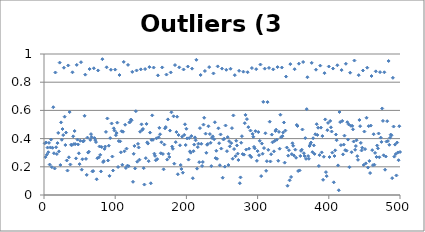
| Category | Outliers (3 dice) |
|---|---|
| 0 | 0.367 |
| 1 | 0.269 |
| 2 | 0.372 |
| 3 | 0.286 |
| 4 | 0.336 |
| 5 | 0.303 |
| 6 | 0.37 |
| 7 | 0.216 |
| 8 | 0.337 |
| 9 | 0.393 |
| 10 | 0.198 |
| 11 | 0.335 |
| 12 | 0.622 |
| 13 | 0.296 |
| 14 | 0.188 |
| 15 | 0.869 |
| 16 | 0.339 |
| 17 | 0.29 |
| 18 | 0.368 |
| 19 | 0.44 |
| 20 | 0.309 |
| 21 | 0.939 |
| 22 | 0.213 |
| 23 | 0.515 |
| 24 | 0.392 |
| 25 | 0.468 |
| 26 | 0.425 |
| 27 | 0.903 |
| 28 | 0.555 |
| 29 | 0.355 |
| 30 | 0.443 |
| 31 | 0.245 |
| 32 | 0.173 |
| 33 | 0.919 |
| 34 | 0.267 |
| 35 | 0.588 |
| 36 | 0.217 |
| 37 | 0.356 |
| 38 | 0.354 |
| 39 | 0.87 |
| 40 | 0.416 |
| 41 | 0.361 |
| 42 | 0.454 |
| 43 | 0.361 |
| 44 | 0.26 |
| 45 | 0.923 |
| 46 | 0.393 |
| 47 | 0.358 |
| 48 | 0.296 |
| 49 | 0.219 |
| 50 | 0.385 |
| 51 | 0.942 |
| 52 | 0.18 |
| 53 | 0.254 |
| 54 | 0.38 |
| 55 | 0.385 |
| 56 | 0.562 |
| 57 | 0.854 |
| 58 | 0.256 |
| 59 | 0.143 |
| 60 | 0.407 |
| 61 | 0.301 |
| 62 | 0.307 |
| 63 | 0.893 |
| 64 | 0.391 |
| 65 | 0.432 |
| 66 | 0.412 |
| 67 | 0.167 |
| 68 | 0.17 |
| 69 | 0.899 |
| 70 | 0.404 |
| 71 | 0.39 |
| 72 | 0.375 |
| 73 | 0.111 |
| 74 | 0.261 |
| 75 | 0.883 |
| 76 | 0.267 |
| 77 | 0.344 |
| 78 | 0.285 |
| 79 | 0.167 |
| 80 | 0.34 |
| 81 | 0.963 |
| 82 | 0.234 |
| 83 | 0.24 |
| 84 | 0.327 |
| 85 | 0.344 |
| 86 | 0.448 |
| 87 | 0.906 |
| 88 | 0.543 |
| 89 | 0.245 |
| 90 | 0.35 |
| 91 | 0.136 |
| 92 | 0.404 |
| 93 | 0.888 |
| 94 | 0.507 |
| 95 | 0.273 |
| 96 | 0.174 |
| 97 | 0.473 |
| 98 | 0.457 |
| 99 | 0.889 |
| 100 | 0.424 |
| 101 | 0.439 |
| 102 | 0.513 |
| 103 | 0.199 |
| 104 | 0.383 |
| 105 | 0.851 |
| 106 | 0.38 |
| 107 | 0.303 |
| 108 | 0.452 |
| 109 | 0.214 |
| 110 | 0.449 |
| 111 | 0.944 |
| 112 | 0.31 |
| 113 | 0.498 |
| 114 | 0.192 |
| 115 | 0.329 |
| 116 | 0.208 |
| 117 | 0.923 |
| 118 | 0.204 |
| 119 | 0.514 |
| 120 | 0.519 |
| 121 | 0.535 |
| 122 | 0.53 |
| 123 | 0.873 |
| 124 | 0.094 |
| 125 | 0.292 |
| 126 | 0.348 |
| 127 | 0.188 |
| 128 | 0.595 |
| 129 | 0.883 |
| 130 | 0.236 |
| 131 | 0.363 |
| 132 | 0.337 |
| 133 | 0.25 |
| 134 | 0.449 |
| 135 | 0.891 |
| 136 | 0.501 |
| 137 | 0.462 |
| 138 | 0.468 |
| 139 | 0.19 |
| 140 | 0.074 |
| 141 | 0.893 |
| 142 | 0.261 |
| 143 | 0.504 |
| 144 | 0.373 |
| 145 | 0.365 |
| 146 | 0.24 |
| 147 | 0.907 |
| 148 | 0.442 |
| 149 | 0.083 |
| 150 | 0.391 |
| 151 | 0.565 |
| 152 | 0.391 |
| 153 | 0.904 |
| 154 | 0.293 |
| 155 | 0.278 |
| 156 | 0.246 |
| 157 | 0.402 |
| 158 | 0.255 |
| 159 | 0.848 |
| 160 | 0.409 |
| 161 | 0.476 |
| 162 | 0.431 |
| 163 | 0.296 |
| 164 | 0.374 |
| 165 | 0.905 |
| 166 | 0.291 |
| 167 | 0.182 |
| 168 | 0.358 |
| 169 | 0.473 |
| 170 | 0.482 |
| 171 | 0.854 |
| 172 | 0.251 |
| 173 | 0.536 |
| 174 | 0.292 |
| 175 | 0.269 |
| 176 | 0.457 |
| 177 | 0.869 |
| 178 | 0.587 |
| 179 | 0.343 |
| 180 | 0.328 |
| 181 | 0.558 |
| 182 | 0.222 |
| 183 | 0.922 |
| 184 | 0.375 |
| 185 | 0.446 |
| 186 | 0.555 |
| 187 | 0.147 |
| 188 | 0.426 |
| 189 | 0.905 |
| 190 | 0.353 |
| 191 | 0.213 |
| 192 | 0.185 |
| 193 | 0.414 |
| 194 | 0.158 |
| 195 | 0.89 |
| 196 | 0.426 |
| 197 | 0.502 |
| 198 | 0.355 |
| 199 | 0.47 |
| 200 | 0.402 |
| 201 | 0.911 |
| 202 | 0.251 |
| 203 | 0.404 |
| 204 | 0.31 |
| 205 | 0.3 |
| 206 | 0.418 |
| 207 | 0.896 |
| 208 | 0.119 |
| 209 | 0.311 |
| 210 | 0.357 |
| 211 | 0.409 |
| 212 | 0.388 |
| 213 | 0.959 |
| 214 | 0.187 |
| 215 | 0.34 |
| 216 | 0.364 |
| 217 | 0.233 |
| 218 | 0.474 |
| 219 | 0.851 |
| 220 | 0.363 |
| 221 | 0.206 |
| 222 | 0.234 |
| 223 | 0.499 |
| 224 | 0.548 |
| 225 | 0.879 |
| 226 | 0.435 |
| 227 | 0.299 |
| 228 | 0.356 |
| 229 | 0.361 |
| 230 | 0.488 |
| 231 | 0.907 |
| 232 | 0.432 |
| 233 | 0.37 |
| 234 | 0.205 |
| 235 | 0.405 |
| 236 | 0.416 |
| 237 | 0.862 |
| 238 | 0.395 |
| 239 | 0.516 |
| 240 | 0.262 |
| 241 | 0.314 |
| 242 | 0.257 |
| 243 | 0.912 |
| 244 | 0.473 |
| 245 | 0.367 |
| 246 | 0.211 |
| 247 | 0.43 |
| 248 | 0.329 |
| 249 | 0.896 |
| 250 | 0.123 |
| 251 | 0.394 |
| 252 | 0.399 |
| 253 | 0.201 |
| 254 | 0.493 |
| 255 | 0.888 |
| 256 | 0.311 |
| 257 | 0.411 |
| 258 | 0.213 |
| 259 | 0.382 |
| 260 | 0.345 |
| 261 | 0.895 |
| 262 | 0.368 |
| 263 | 0.474 |
| 264 | 0.257 |
| 265 | 0.564 |
| 266 | 0.326 |
| 267 | 0.85 |
| 268 | 0.275 |
| 269 | 0.385 |
| 270 | 0.352 |
| 271 | 0.293 |
| 272 | 0.248 |
| 273 | 0.881 |
| 274 | 0.084 |
| 275 | 0.125 |
| 276 | 0.371 |
| 277 | 0.417 |
| 278 | 0.29 |
| 279 | 0.875 |
| 280 | 0.286 |
| 281 | 0.509 |
| 282 | 0.568 |
| 283 | 0.322 |
| 284 | 0.538 |
| 285 | 0.871 |
| 286 | 0.482 |
| 287 | 0.328 |
| 288 | 0.28 |
| 289 | 0.457 |
| 290 | 0.269 |
| 291 | 0.9 |
| 292 | 0.433 |
| 293 | 0.413 |
| 294 | 0.341 |
| 295 | 0.33 |
| 296 | 0.453 |
| 297 | 0.892 |
| 298 | 0.242 |
| 299 | 0.311 |
| 300 | 0.447 |
| 301 | 0.282 |
| 302 | 0.384 |
| 303 | 0.925 |
| 304 | 0.134 |
| 305 | 0.365 |
| 306 | 0.293 |
| 307 | 0.661 |
| 308 | 0.333 |
| 309 | 0.896 |
| 310 | 0.438 |
| 311 | 0.171 |
| 312 | 0.24 |
| 313 | 0.659 |
| 314 | 0.32 |
| 315 | 0.901 |
| 316 | 0.52 |
| 317 | 0.238 |
| 318 | 0.289 |
| 319 | 0.428 |
| 320 | 0.374 |
| 321 | 0.891 |
| 322 | 0.31 |
| 323 | 0.384 |
| 324 | 0.454 |
| 325 | 0.463 |
| 326 | 0.392 |
| 327 | 0.907 |
| 328 | 0.243 |
| 329 | 0.448 |
| 330 | 0.328 |
| 331 | 0.569 |
| 332 | 0.41 |
| 333 | 0.904 |
| 334 | 0.418 |
| 335 | 0.443 |
| 336 | 0.514 |
| 337 | 0.229 |
| 338 | 0.457 |
| 339 | 0.84 |
| 340 | 0.337 |
| 341 | 0.066 |
| 342 | 0.279 |
| 343 | 0.318 |
| 344 | 0.104 |
| 345 | 0.928 |
| 346 | 0.128 |
| 347 | 0.29 |
| 348 | 0.367 |
| 349 | 0.349 |
| 350 | 0.281 |
| 351 | 0.892 |
| 352 | 0.322 |
| 353 | 0.264 |
| 354 | 0.497 |
| 355 | 0.489 |
| 356 | 0.17 |
| 357 | 0.931 |
| 358 | 0.174 |
| 359 | 0.277 |
| 360 | 0.313 |
| 361 | 0.321 |
| 362 | 0.465 |
| 363 | 0.943 |
| 364 | 0.296 |
| 365 | 0.276 |
| 366 | 0.403 |
| 367 | 0.257 |
| 368 | 0.609 |
| 369 | 0.835 |
| 370 | 0.276 |
| 371 | 0.257 |
| 372 | 0.348 |
| 373 | 0.361 |
| 374 | 0.372 |
| 375 | 0.937 |
| 376 | 0.304 |
| 377 | 0.402 |
| 378 | 0.352 |
| 379 | 0.291 |
| 380 | 0.431 |
| 381 | 0.889 |
| 382 | 0.502 |
| 383 | 0.426 |
| 384 | 0.477 |
| 385 | 0.206 |
| 386 | 0.283 |
| 387 | 0.918 |
| 388 | 0.478 |
| 389 | 0.302 |
| 390 | 0.418 |
| 391 | 0.108 |
| 392 | 0.271 |
| 393 | 0.864 |
| 394 | 0.536 |
| 395 | 0.162 |
| 396 | 0.134 |
| 397 | 0.46 |
| 398 | 0.511 |
| 399 | 0.911 |
| 400 | 0.269 |
| 401 | 0.525 |
| 402 | 0.48 |
| 403 | 0.45 |
| 404 | 0.301 |
| 405 | 0.897 |
| 406 | 0.09 |
| 407 | 0.277 |
| 408 | 0.317 |
| 409 | 0.429 |
| 410 | 0.389 |
| 411 | 0.92 |
| 412 | 0.21 |
| 413 | 0.034 |
| 414 | 0.589 |
| 415 | 0.517 |
| 416 | 0.354 |
| 417 | 0.886 |
| 418 | 0.526 |
| 419 | 0.288 |
| 420 | 0.357 |
| 421 | 0.421 |
| 422 | 0.318 |
| 423 | 0.931 |
| 424 | 0.314 |
| 425 | 0.516 |
| 426 | 0.393 |
| 427 | 0.5 |
| 428 | 0.197 |
| 429 | 0.867 |
| 430 | 0.491 |
| 431 | 0.304 |
| 432 | 0.49 |
| 433 | 0.466 |
| 434 | 0.379 |
| 435 | 0.954 |
| 436 | 0.321 |
| 437 | 0.347 |
| 438 | 0.388 |
| 439 | 0.275 |
| 440 | 0.25 |
| 441 | 0.85 |
| 442 | 0.532 |
| 443 | 0.488 |
| 444 | 0.37 |
| 445 | 0.316 |
| 446 | 0.335 |
| 447 | 0.883 |
| 448 | 0.213 |
| 449 | 0.45 |
| 450 | 0.325 |
| 451 | 0.224 |
| 452 | 0.548 |
| 453 | 0.903 |
| 454 | 0.195 |
| 455 | 0.489 |
| 456 | 0.242 |
| 457 | 0.156 |
| 458 | 0.492 |
| 459 | 0.844 |
| 460 | 0.318 |
| 461 | 0.212 |
| 462 | 0.431 |
| 463 | 0.215 |
| 464 | 0.299 |
| 465 | 0.877 |
| 466 | 0.27 |
| 467 | 0.351 |
| 468 | 0.331 |
| 469 | 0.436 |
| 470 | 0.268 |
| 471 | 0.871 |
| 472 | 0.407 |
| 473 | 0.377 |
| 474 | 0.614 |
| 475 | 0.526 |
| 476 | 0.282 |
| 477 | 0.87 |
| 478 | 0.179 |
| 479 | 0.273 |
| 480 | 0.379 |
| 481 | 0.524 |
| 482 | 0.383 |
| 483 | 0.95 |
| 484 | 0.356 |
| 485 | 0.406 |
| 486 | 0.428 |
| 487 | 0.423 |
| 488 | 0.119 |
| 489 | 0.831 |
| 490 | 0.486 |
| 491 | 0.272 |
| 492 | 0.357 |
| 493 | 0.29 |
| 494 | 0.139 |
| 495 | 0.372 |
| 496 | 0.302 |
| 497 | 0.247 |
| 498 | 0.488 |
| 499 | 0.305 |